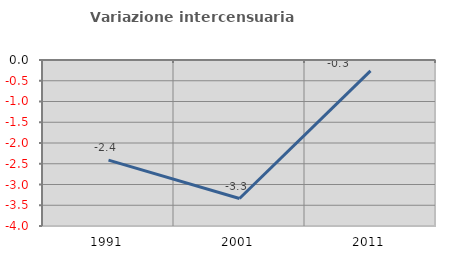
| Category | Variazione intercensuaria annua |
|---|---|
| 1991.0 | -2.414 |
| 2001.0 | -3.337 |
| 2011.0 | -0.262 |